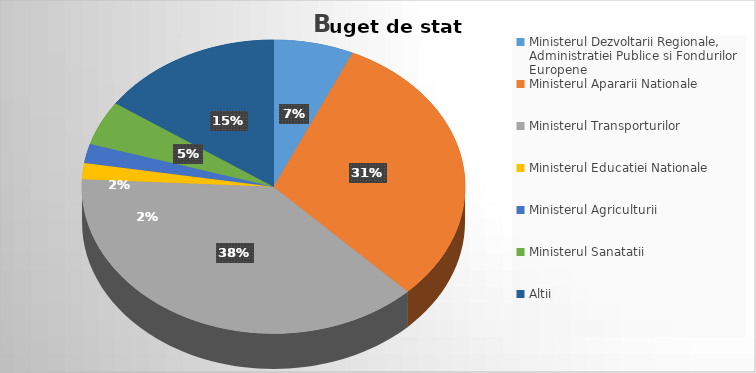
| Category | Series 0 |
|---|---|
| Ministerul Dezvoltarii Regionale, Administratiei Publice si Fondurilor Europene | 6.754 |
| Ministerul Apararii Nationale | 30.914 |
| Ministerul Transporturilor | 38.133 |
| Ministerul Educatiei Nationale | 1.777 |
| Ministerul Agriculturii | 2.129 |
| Ministerul Sanatatii | 4.881 |
| Altii | 15.411 |